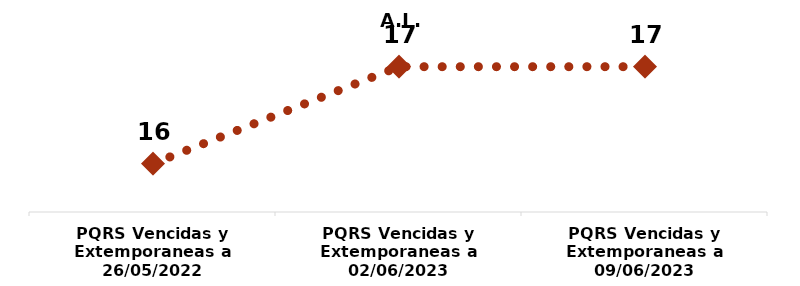
| Category | A.L. CANDELARIA |
|---|---|
| PQRS Vencidas y Extemporaneas a 26/05/2022 | 16 |
| PQRS Vencidas y Extemporaneas a 02/06/2023 | 17 |
| PQRS Vencidas y Extemporaneas a 09/06/2023 | 17 |